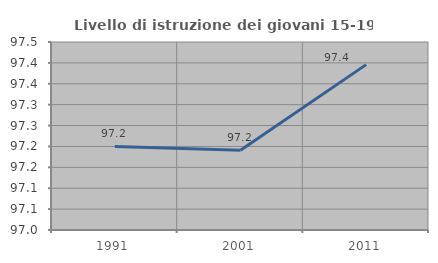
| Category | Livello di istruzione dei giovani 15-19 anni |
|---|---|
| 1991.0 | 97.2 |
| 2001.0 | 97.191 |
| 2011.0 | 97.396 |